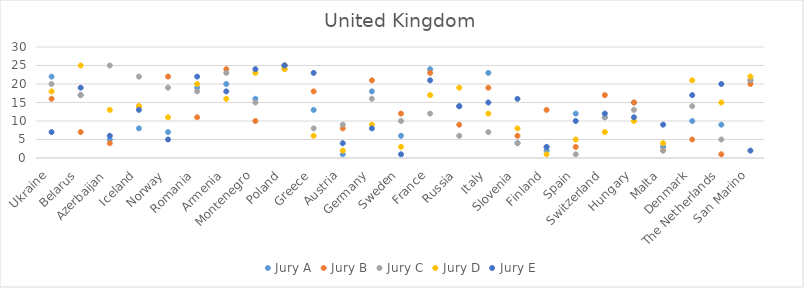
| Category | Jury A | Jury B | Jury C | Jury D | Jury E |
|---|---|---|---|---|---|
| Ukraine | 22 | 16 | 20 | 18 | 7 |
| Belarus | 17 | 7 | 17 | 25 | 19 |
| Azerbaijan | 5 | 4 | 25 | 13 | 6 |
| Iceland | 8 | 14 | 22 | 14 | 13 |
| Norway | 7 | 22 | 19 | 11 | 5 |
| Romania | 19 | 11 | 18 | 20 | 22 |
| Armenia | 20 | 24 | 23 | 16 | 18 |
| Montenegro | 16 | 10 | 15 | 23 | 24 |
| Poland | 25 | 25 | 24 | 24 | 25 |
| Greece | 13 | 18 | 8 | 6 | 23 |
| Austria | 1 | 8 | 9 | 2 | 4 |
| Germany | 18 | 21 | 16 | 9 | 8 |
| Sweden | 6 | 12 | 10 | 3 | 1 |
| France | 24 | 23 | 12 | 17 | 21 |
| Russia | 14 | 9 | 6 | 19 | 14 |
| Italy | 23 | 19 | 7 | 12 | 15 |
| Slovenia | 4 | 6 | 4 | 8 | 16 |
| Finland | 2 | 13 | 3 | 1 | 3 |
| Spain | 12 | 3 | 1 | 5 | 10 |
| Switzerland | 11 | 17 | 11 | 7 | 12 |
| Hungary | 15 | 15 | 13 | 10 | 11 |
| Malta | 3 | 2 | 2 | 4 | 9 |
| Denmark | 10 | 5 | 14 | 21 | 17 |
| The Netherlands | 9 | 1 | 5 | 15 | 20 |
| San Marino | 21 | 20 | 21 | 22 | 2 |